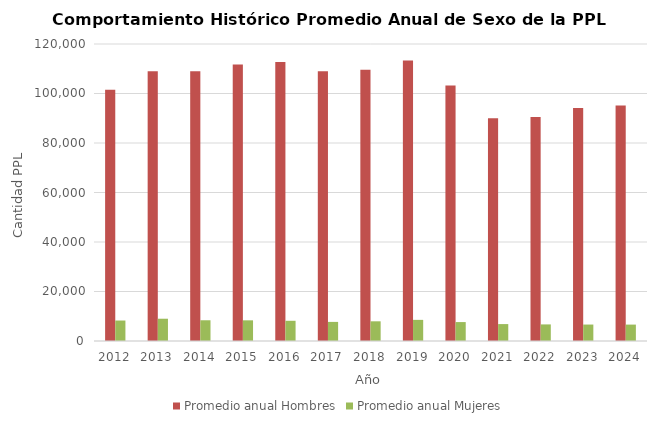
| Category | Promedio anual Hombres | Promedio anual Mujeres |
|---|---|---|
| 2012.0 | 101548.333 | 8273.75 |
| 2013.0 | 108988.333 | 8997.917 |
| 2014.0 | 109009.667 | 8379.417 |
| 2015.0 | 111689.083 | 8351 |
| 2016.0 | 112747 | 8167 |
| 2017.0 | 108939.917 | 7717.75 |
| 2018.0 | 109615.417 | 7954.167 |
| 2019.0 | 113308.833 | 8538.5 |
| 2020.0 | 103182.75 | 7647.583 |
| 2021.0 | 90002.917 | 6834.583 |
| 2022.0 | 90472.5 | 6703.417 |
| 2023.0 | 94091.083 | 6646.667 |
| 2024.0 | 95152 | 6629 |